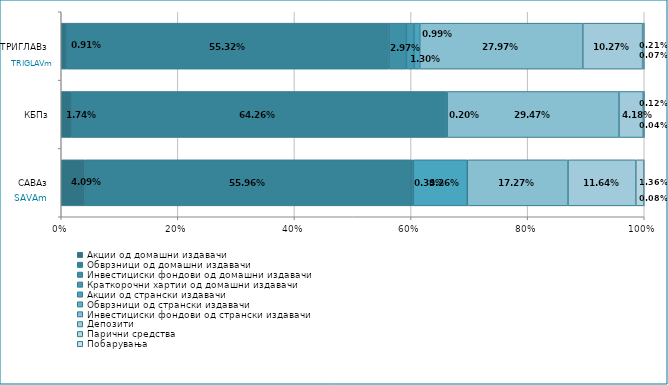
| Category | Акции од домашни издавачи  | Обврзници од домашни издавачи  | Инвестициски фондови од домашни издавачи  | Краткорочни хартии од домашни издавачи  | Акции од странски издавачи  | Обврзници од странски издавачи  | Инвестициски фондови од странски издавaчи | Депозити  | Парични средства  | Побарувања |
|---|---|---|---|---|---|---|---|---|---|---|
| САВАз | 0.041 | 0.56 | 0.003 | 0 | 0.093 | 0 | 0.173 | 0.116 | 0.014 | 0.001 |
| КБПз | 0.017 | 0.643 | 0.002 | 0 | 0 | 0 | 0.295 | 0.042 | 0.001 | 0 |
| ТРИГЛАВз | 0.009 | 0.553 | 0.03 | 0.013 | 0.01 | 0 | 0.28 | 0.103 | 0.002 | 0.001 |